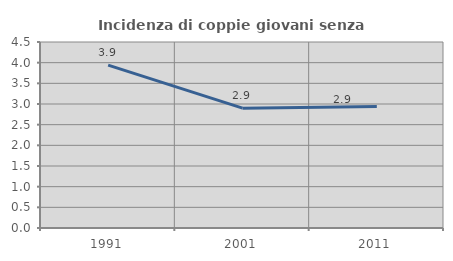
| Category | Incidenza di coppie giovani senza figli |
|---|---|
| 1991.0 | 3.941 |
| 2001.0 | 2.899 |
| 2011.0 | 2.941 |